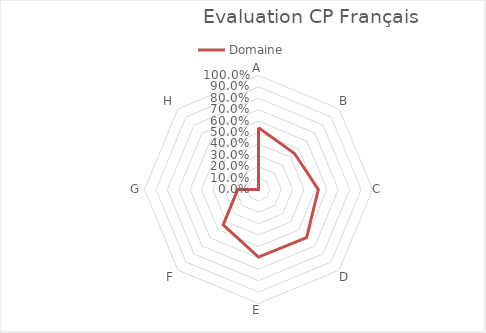
| Category | Domaine |
|---|---|
| A | 0.543 |
| B | 0.446 |
| C | 0.525 |
| D | 0.596 |
| E | 0.593 |
| F | 0.438 |
| G | 0.182 |
| H | 0 |